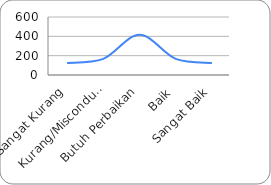
| Category | Pola Distribusi |
|---|---|
| Sangat Kurang | 125 |
| Kurang/Misconduct | 166.667 |
| Butuh Perbaikan | 416.667 |
| Baik | 166.667 |
| Sangat Baik | 125 |